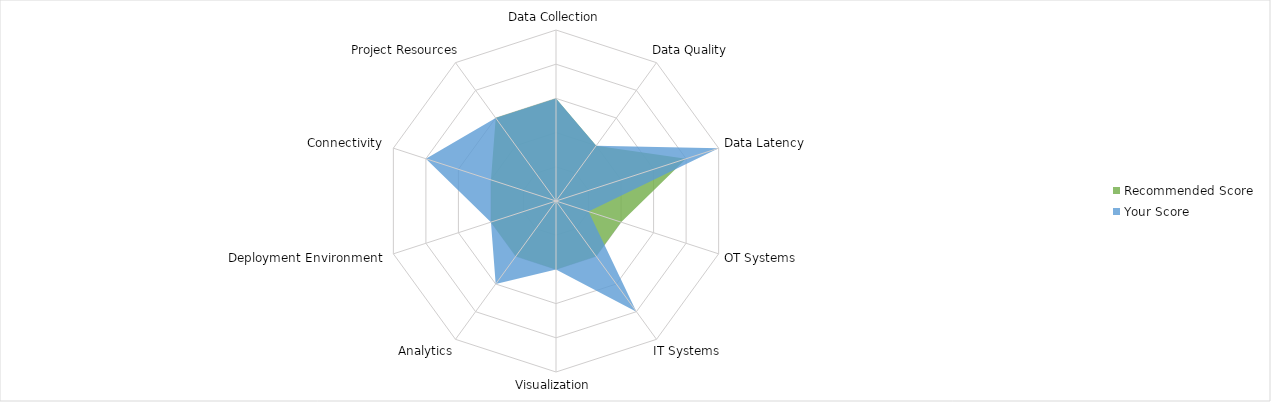
| Category | Recommended Score | Your Score |
|---|---|---|
| Data Collection | 3 | 3 |
| Data Quality | 2 | 2 |
| Data Latency | 4 | 5 |
| OT Systems | 2 | 1 |
| IT Systems | 2 | 4 |
| Visualization | 2 | 2 |
| Analytics | 2 | 3 |
| Deployment Environment | 2 | 2 |
| Connectivity | 2 | 4 |
| Project Resources | 3 | 3 |